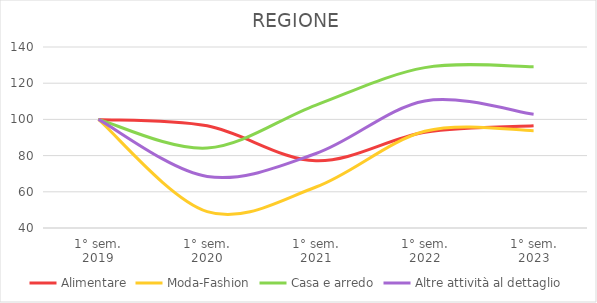
| Category | Alimentare | Moda-Fashion | Casa e arredo | Altre attività al dettaglio |
|---|---|---|---|---|
| 1° sem.
2019 | 100 | 100 | 100 | 100 |
| 1° sem.
2020 | 96.454 | 49.084 | 84.166 | 68.48 |
| 1° sem.
2021 | 77.151 | 62.666 | 107.917 | 81.182 |
| 1° sem.
2022 | 92.883 | 93.447 | 128.593 | 110.188 |
| 1° sem.
2023 | 96.467 | 93.799 | 129.131 | 102.814 |